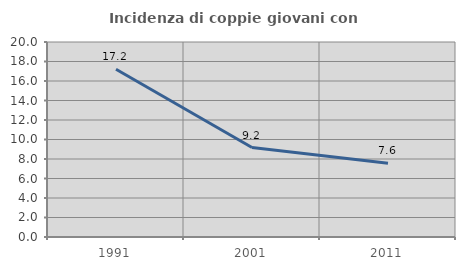
| Category | Incidenza di coppie giovani con figli |
|---|---|
| 1991.0 | 17.211 |
| 2001.0 | 9.172 |
| 2011.0 | 7.556 |